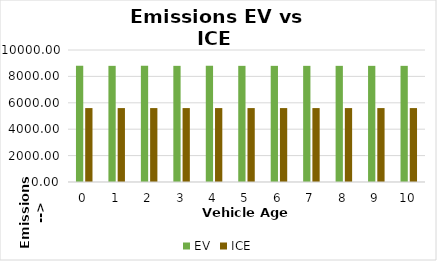
| Category | EV | ICE |
|---|---|---|
| 0.0 | 8800 | 5600 |
| 1.0 | 8800 | 5600 |
| 2.0 | 8800 | 5600 |
| 3.0 | 8800 | 5600 |
| 4.0 | 8800 | 5600 |
| 5.0 | 8800 | 5600 |
| 6.0 | 8800 | 5600 |
| 7.0 | 8800 | 5600 |
| 8.0 | 8800 | 5600 |
| 9.0 | 8800 | 5600 |
| 10.0 | 8800 | 5600 |